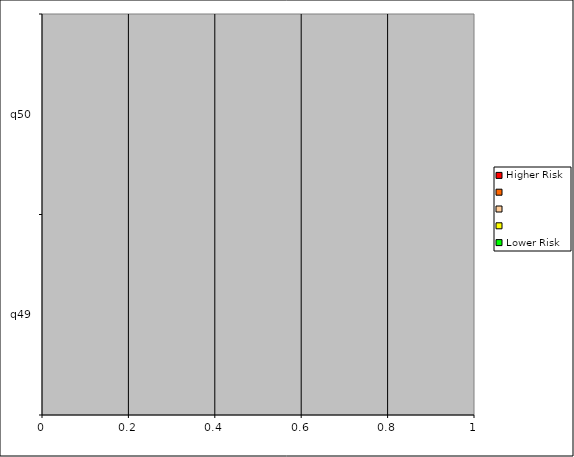
| Category | Higher Risk |   | Lower Risk |
|---|---|---|---|
| q49 | 0 | 0 | 0 |
| q50 | 0 | 0 | 0 |